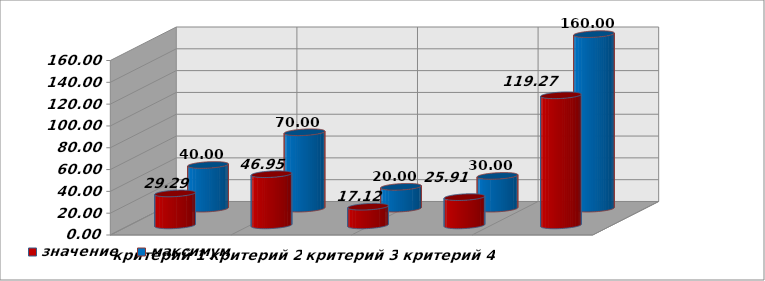
| Category | значение | максимум |
|---|---|---|
| критерий 1 | 29.288 | 40 |
| критерий 2 | 46.949 | 70 |
| критерий 3 | 17.123 | 20 |
| критерий 4 | 25.906 | 30 |